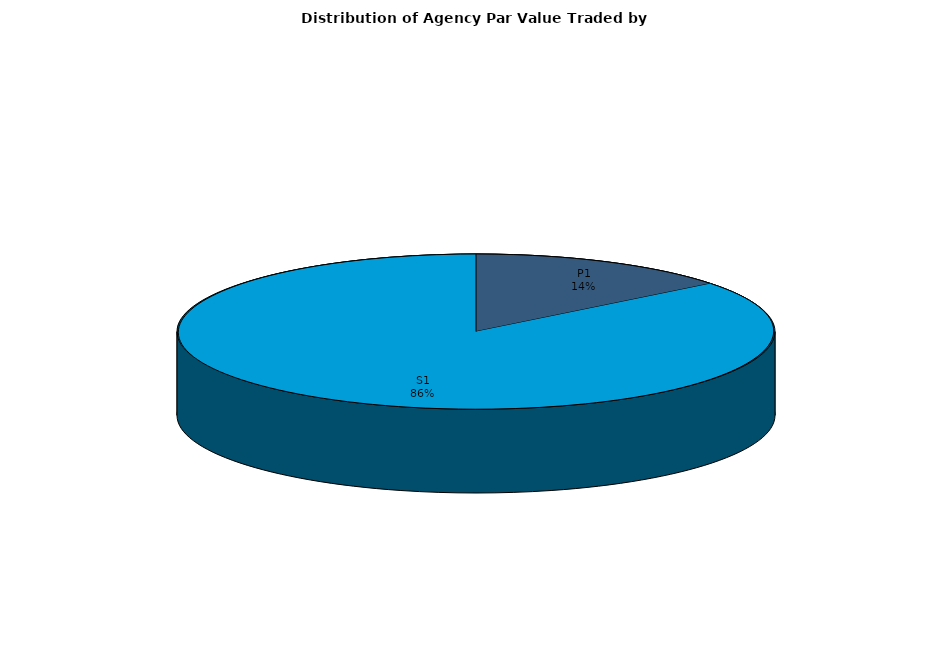
| Category | Series 0 |
|---|---|
| P1 | 474549278.884 |
| S1 | 2829313622.182 |